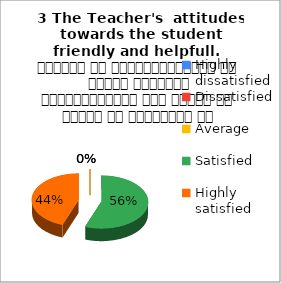
| Category | 3 The Teacher's  attitudes towards the student friendly and helpfull.   शिक्षक का विद्यार्थियों के प्रति व्यवहार मित्रतापूर्ण एवम सहयोग के भावना से परिपूर्ण था |
|---|---|
| Highly dissatisfied | 0 |
| Dissatisfied | 0 |
| Average | 0 |
| Satisfied | 5 |
| Highly satisfied | 4 |